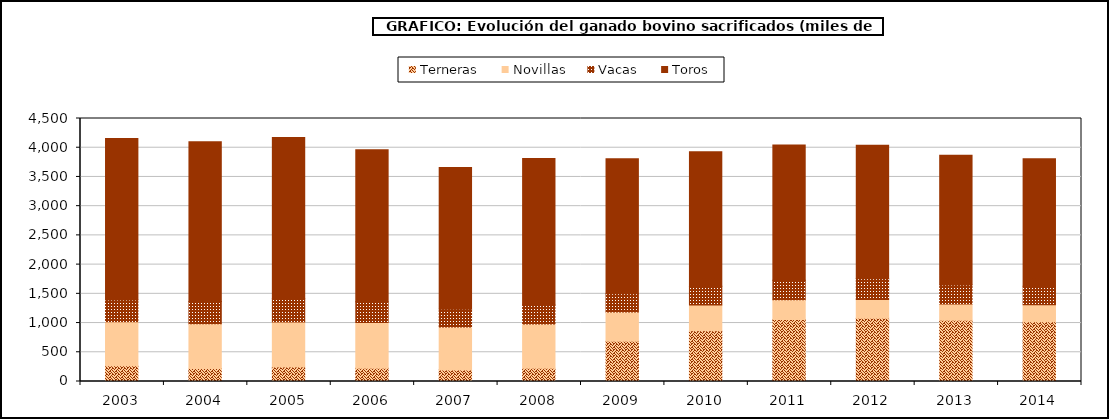
| Category | Terneras | Novillas | Vacas | Toros |
|---|---|---|---|---|
| 2003.0 | 269.48 | 751.965 | 374.846 | 2763.095 |
| 2004.0 | 220.638 | 767.767 | 380.128 | 2732.046 |
| 2005.0 | 246.944 | 769.645 | 400.576 | 2757.558 |
| 2006.0 | 227.871 | 780.95 | 355.484 | 2599.095 |
| 2007.0 | 197.822 | 735.107 | 301.795 | 2427.983 |
| 2008.0 | 225.783 | 758.655 | 323.877 | 2506.734 |
| 2009.0 | 690.106 | 500.364 | 312.199 | 2306.595 |
| 2010.0 | 869.716 | 439.941 | 318.432 | 2302.089 |
| 2011.0 | 1059.2 | 339.951 | 331.79 | 2314.752 |
| 2012.0 | 1083.19 | 319.983 | 353.838 | 2285.924 |
| 2013.0 | 1050.071 | 276.098 | 323.4 | 2222.003 |
| 2014.0 | 1023.638 | 289.637 | 314.523 | 2182.59 |